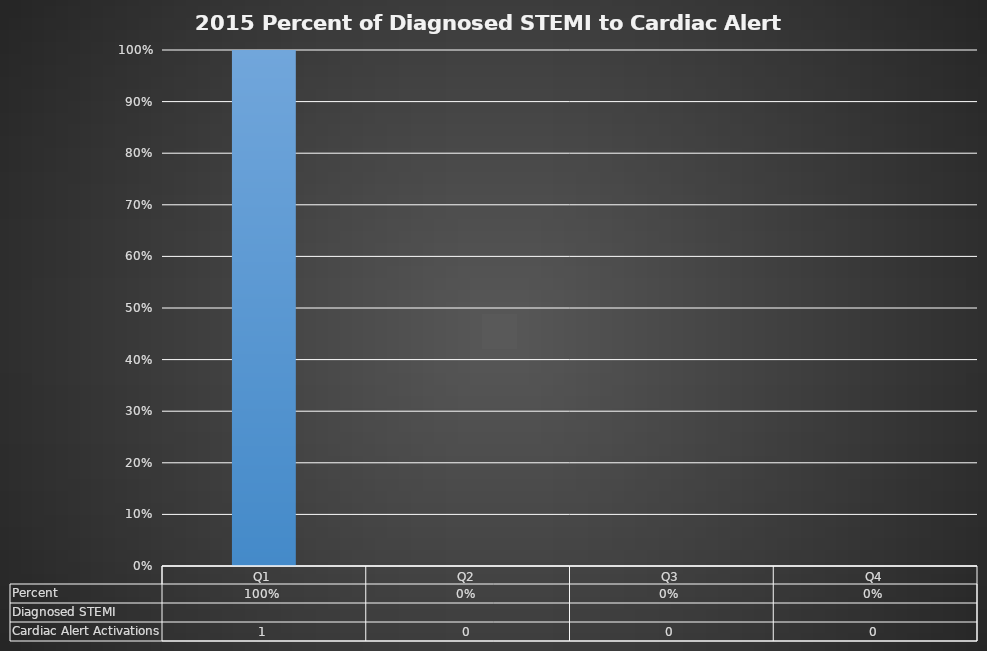
| Category | Percent |
|---|---|
| Q1 | 1 |
| Q2 | 0 |
| Q3 | 0 |
| Q4 | 0 |